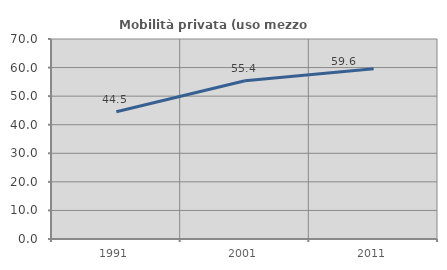
| Category | Mobilità privata (uso mezzo privato) |
|---|---|
| 1991.0 | 44.518 |
| 2001.0 | 55.386 |
| 2011.0 | 59.604 |